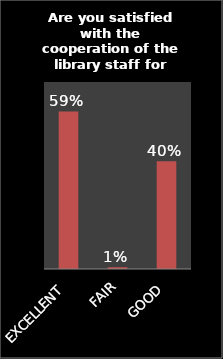
| Category | Series 0 |
|---|---|
| EXCELLENT | 0.59 |
| FAIR | 0.007 |
| GOOD | 0.403 |